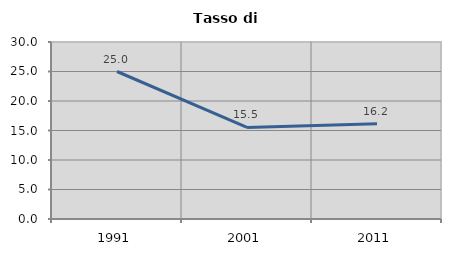
| Category | Tasso di disoccupazione   |
|---|---|
| 1991.0 | 25 |
| 2001.0 | 15.509 |
| 2011.0 | 16.154 |